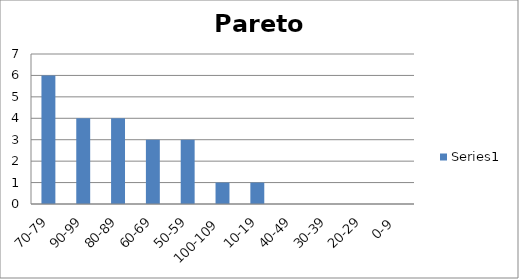
| Category | Series 0 |
|---|---|
| 70-79 | 6 |
| 90-99 | 4 |
| 80-89 | 4 |
| 60-69 | 3 |
| 50-59 | 3 |
| 100-109 | 1 |
| 10-19 | 1 |
| 40-49 | 0 |
| 30-39 | 0 |
| 20-29 | 0 |
| 0-9 | 0 |